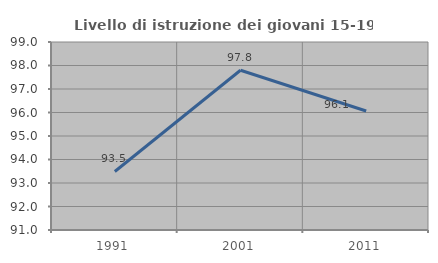
| Category | Livello di istruzione dei giovani 15-19 anni |
|---|---|
| 1991.0 | 93.491 |
| 2001.0 | 97.797 |
| 2011.0 | 96.063 |